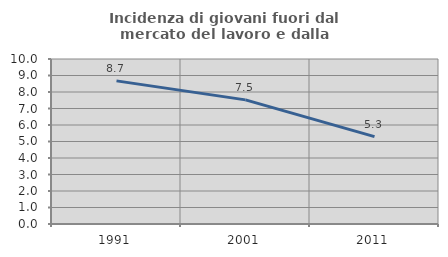
| Category | Incidenza di giovani fuori dal mercato del lavoro e dalla formazione  |
|---|---|
| 1991.0 | 8.674 |
| 2001.0 | 7.524 |
| 2011.0 | 5.294 |